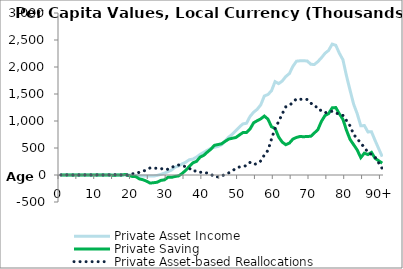
| Category | Private Asset Income | Private Saving | Private Asset-based Reallocations |
|---|---|---|---|
| 0 | 0 | -1228.666 | 1228.666 |
|  | 0 | -949.947 | 949.947 |
| 2 | 0 | -1680.346 | 1680.346 |
| 3 | 0 | -458.988 | 458.988 |
| 4 | 0 | 521.039 | -521.039 |
| 5 | 0 | -733.826 | 733.826 |
| 6 | 0 | -1423.179 | 1423.179 |
| 7 | 0 | -1323.464 | 1323.464 |
| 8 | 0 | -1103.481 | 1103.481 |
| 9 | 0 | -1303.364 | 1303.364 |
| 10 | 0 | -1678.179 | 1678.179 |
| 11 | 0 | -1464.291 | 1464.291 |
| 12 | 0 | -1002.726 | 1002.726 |
| 13 | 0 | -1477.637 | 1477.637 |
| 14 | 0 | -1778.967 | 1778.967 |
| 15 | 0 | -5637.399 | 5637.399 |
| 16 | 0 | 600.751 | -600.751 |
| 17 | 524.776 | -428.441 | 953.216 |
| 18 | 1459.77 | 9091.741 | -7631.971 |
| 19 | -284.679 | -8056.224 | 7771.545 |
| 20 | -2486.704 | -26422.376 | 23935.672 |
| 21 | -6895.2 | -29823.221 | 22928.021 |
| 22 | -20667.075 | -72368.399 | 51701.324 |
| 23 | -18119.142 | -87641.086 | 69521.944 |
| 24 | -19407.6 | -113687.446 | 94279.846 |
| 25 | -18575.128 | -149508.18 | 130933.053 |
| 26 | -19051.375 | -142829.864 | 123778.489 |
| 27 | -7383.158 | -134027.124 | 126643.966 |
| 28 | 12431.696 | -99811.84 | 112243.536 |
| 29 | 34120.1 | -90216.575 | 124336.676 |
| 30 | 61204.377 | -43352.32 | 104556.697 |
| 31 | 91311.316 | -43944.012 | 135255.328 |
| 32 | 146337.405 | -26891.618 | 173229.023 |
| 33 | 168638.665 | -16694.223 | 185332.888 |
| 34 | 206272.069 | 29077.461 | 177194.608 |
| 35 | 238120.903 | 87323.399 | 150797.504 |
| 36 | 283029.715 | 159216.771 | 123812.944 |
| 37 | 294558.402 | 226292.174 | 68266.228 |
| 38 | 331682.161 | 251633.824 | 80048.337 |
| 39 | 380274.344 | 329964.568 | 50309.776 |
| 40 | 417831.69 | 362360.426 | 55471.264 |
| 41 | 456970.178 | 422310.286 | 34659.892 |
| 42 | 492285.819 | 475822.411 | 16463.408 |
| 43 | 513411.606 | 549489.005 | -36077.398 |
| 44 | 529075.191 | 563633.16 | -34557.969 |
| 45 | 561309.721 | 577415.088 | -16105.367 |
| 46 | 628947.926 | 621709.68 | 7238.246 |
| 47 | 702016.579 | 664350.562 | 37666.017 |
| 48 | 752952.554 | 680429.189 | 72523.364 |
| 49 | 818454.893 | 693495.313 | 124959.58 |
| 50 | 888434.221 | 740623.603 | 147810.618 |
| 51 | 946332.254 | 785691.462 | 160640.791 |
| 52 | 958407.85 | 784918.636 | 173489.213 |
| 53 | 1085099.448 | 851907.464 | 233191.985 |
| 54 | 1163150.146 | 967509.888 | 195640.259 |
| 55 | 1216556.057 | 1005378.464 | 211177.593 |
| 56 | 1300187.362 | 1039809.321 | 260378.041 |
| 57 | 1463591.212 | 1091378.329 | 372212.883 |
| 58 | 1490130.14 | 1034828.451 | 455301.689 |
| 59 | 1559578.115 | 893331.924 | 666246.19 |
| 60 | 1729373.364 | 862632.641 | 866740.723 |
| 61 | 1692099.095 | 703676.275 | 988422.821 |
| 62 | 1739922.225 | 609077.476 | 1130844.748 |
| 63 | 1822869.082 | 561223.006 | 1261646.076 |
| 64 | 1877875.06 | 590688.641 | 1287186.419 |
| 65 | 2012762.826 | 665577.022 | 1347185.804 |
| 66 | 2107787.18 | 695973.695 | 1411813.486 |
| 67 | 2114785.293 | 713643.872 | 1401141.421 |
| 68 | 2115433.558 | 708490.881 | 1406942.676 |
| 69 | 2111602.342 | 713885.545 | 1397716.797 |
| 70 | 2050553.125 | 716502.692 | 1334050.433 |
| 71 | 2046126.454 | 777611.565 | 1268514.889 |
| 72 | 2100831.304 | 842522.67 | 1258308.634 |
| 73 | 2172714.169 | 995959.06 | 1176755.109 |
| 74 | 2254555.16 | 1101960.459 | 1152594.701 |
| 75 | 2307681.184 | 1138313.967 | 1169367.217 |
| 76 | 2424306.511 | 1243855.181 | 1180451.33 |
| 77 | 2401725.766 | 1248892.078 | 1152833.688 |
| 78 | 2254486.323 | 1133358.971 | 1121127.352 |
| 79 | 2134516.07 | 1030898.797 | 1103617.273 |
| 80 | 1834936.618 | 827310.24 | 1007626.378 |
| 81 | 1568794.944 | 658398.931 | 910396.013 |
| 82 | 1310886.696 | 561123.86 | 749762.836 |
| 83 | 1134368.668 | 462310.959 | 672057.71 |
| 84 | 911590.022 | 322355.268 | 589234.754 |
| 85 | 915591.105 | 404703.671 | 510887.434 |
| 86 | 798125.003 | 378703.409 | 419421.594 |
| 87 | 799774.062 | 418887.419 | 380886.643 |
| 88 | 639797.558 | 308424.963 | 331372.596 |
| 89 | 489901.57 | 263893.368 | 226008.201 |
| 90+ | 340005.581 | 219361.774 | 120643.806 |